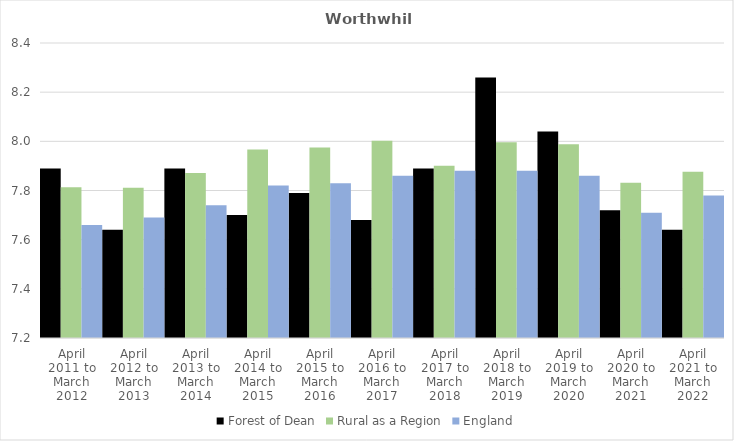
| Category | Forest of Dean | Rural as a Region | England |
|---|---|---|---|
| April 2011 to March 2012 | 7.89 | 7.813 | 7.66 |
| April 2012 to March 2013 | 7.64 | 7.811 | 7.69 |
| April 2013 to March 2014 | 7.89 | 7.871 | 7.74 |
| April 2014 to March 2015 | 7.7 | 7.967 | 7.82 |
| April 2015 to March 2016 | 7.79 | 7.975 | 7.83 |
| April 2016 to March 2017 | 7.68 | 8.002 | 7.86 |
| April 2017 to March 2018 | 7.89 | 7.9 | 7.88 |
| April 2018 to March 2019 | 8.26 | 7.996 | 7.88 |
| April 2019 to March 2020 | 8.04 | 7.988 | 7.86 |
| April 2020 to March 2021 | 7.72 | 7.831 | 7.71 |
| April 2021 to March 2022 | 7.64 | 7.877 | 7.78 |